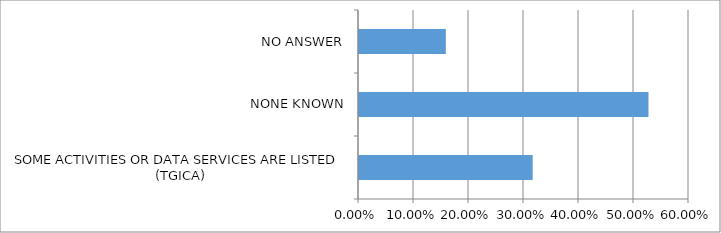
| Category | Series 0 |
|---|---|
| SOME ACTIVITIES OR DATA SERVICES ARE LISTED (TGICA) | 0.316 |
| NONE KNOWN | 0.526 |
| NO ANSWER | 0.158 |